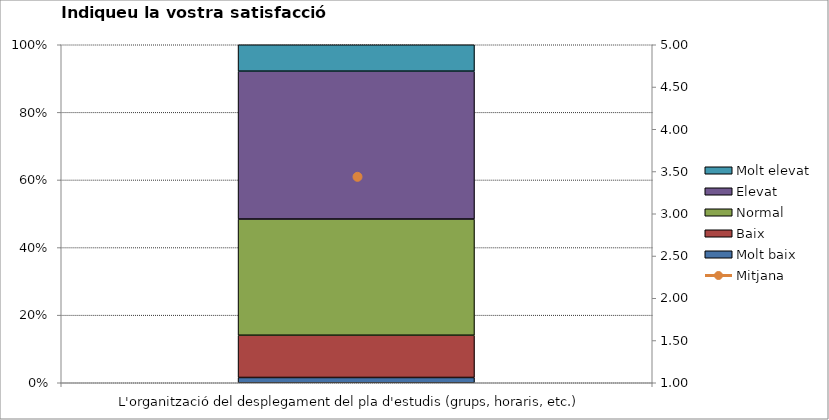
| Category | Molt baix | Baix | Normal  | Elevat | Molt elevat |
|---|---|---|---|---|---|
| L'organització del desplegament del pla d'estudis (grups, horaris, etc.) | 1 | 8 | 22 | 28 | 5 |